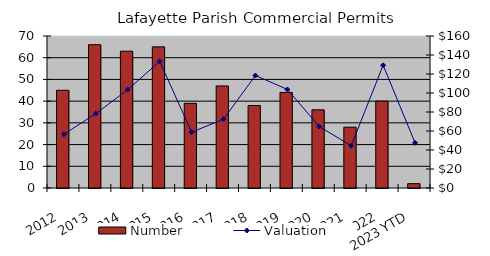
| Category | Number |
|---|---|
| 2012 | 45 |
| 2013 | 66 |
| 2014 | 63 |
| 2015 | 65 |
| 2016 | 39 |
| 2017 | 47 |
| 2018 | 38 |
| 2019 | 44 |
| 2020 | 36 |
| 2021 | 28 |
| 2022 | 40 |
| 2023 YTD | 2 |